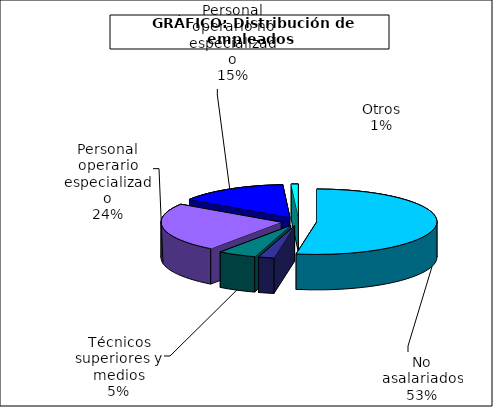
| Category | Series 0 |
|---|---|
| No asalariados | 6582.455 |
| Administrativos | 262.976 |
| Técnicos superiores y medios | 639.051 |
| Personal operario especializado | 3029.626 |
| Personal operario no especializado | 1846.04 |
| Otros | 117.656 |